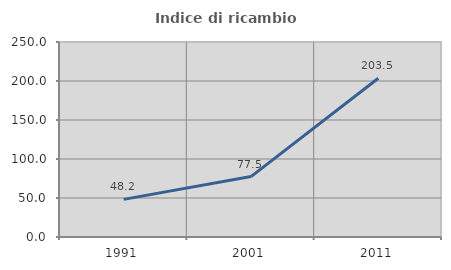
| Category | Indice di ricambio occupazionale  |
|---|---|
| 1991.0 | 48.211 |
| 2001.0 | 77.474 |
| 2011.0 | 203.488 |